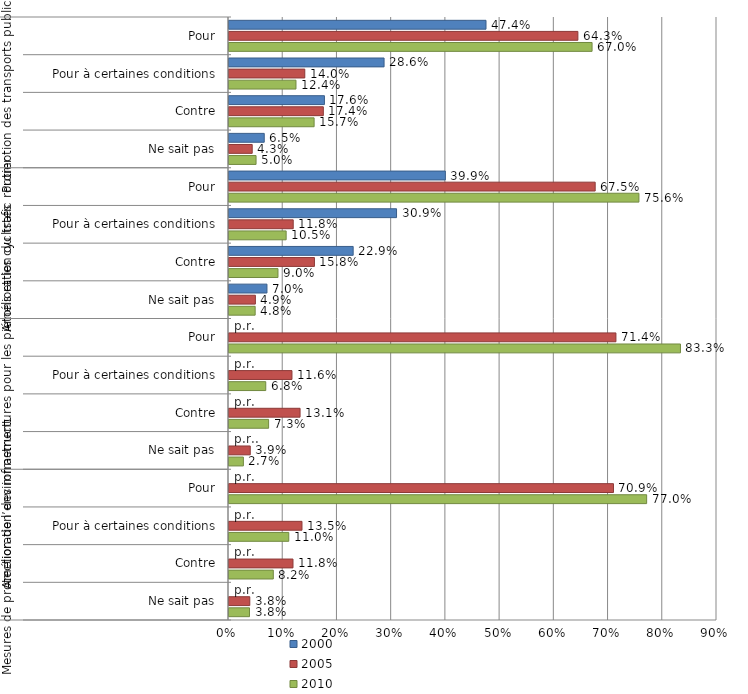
| Category | 2000 | 2005 | 2010 |
|---|---|---|---|
| 0 | 47.4 | 64.343 | 66.959 |
| 1 | 28.6 | 13.979 | 12.354 |
| 2 | 17.6 | 17.399 | 15.697 |
| 3 | 6.5 | 4.28 | 4.99 |
| 4 | 39.9 | 67.534 | 75.602 |
| 5 | 30.9 | 11.844 | 10.54 |
| 6 | 22.9 | 15.756 | 9.033 |
| 7 | 7 | 4.866 | 4.825 |
| 8 | 0 | 71.36 | 83.26 |
| 9 | 0 | 11.612 | 6.779 |
| 10 | 0 | 13.107 | 7.308 |
| 11 | 0 | 3.921 | 2.654 |
| 12 | 0 | 70.907 | 77.025 |
| 13 | 0 | 13.458 | 11.023 |
| 14 | 0 | 11.801 | 8.17 |
| 15 | 0 | 3.834 | 3.783 |